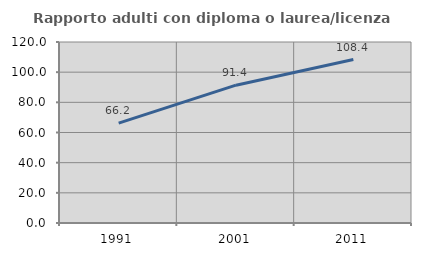
| Category | Rapporto adulti con diploma o laurea/licenza media  |
|---|---|
| 1991.0 | 66.176 |
| 2001.0 | 91.363 |
| 2011.0 | 108.381 |